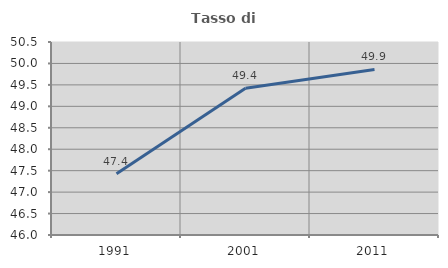
| Category | Tasso di occupazione   |
|---|---|
| 1991.0 | 47.429 |
| 2001.0 | 49.421 |
| 2011.0 | 49.859 |